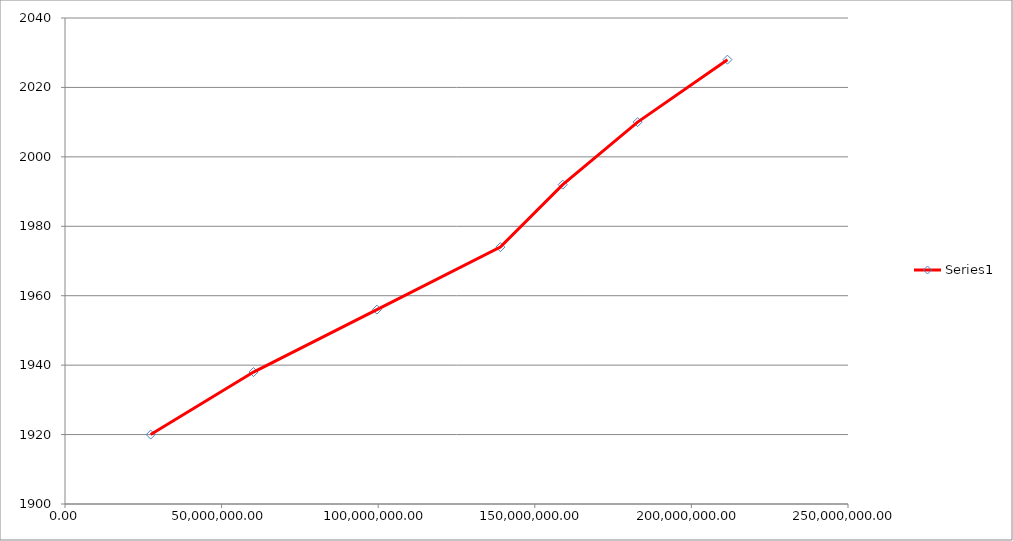
| Category | Series 0 |
|---|---|
| 27362000.0 | 1920 |
| 60196400.0 | 1938 |
| 99597680.0 | 1956 |
| 138998960.0 | 1974 |
| 158918496.0 | 1992 |
| 182821939.2 | 2010 |
| 211506071.03999996 | 2028 |